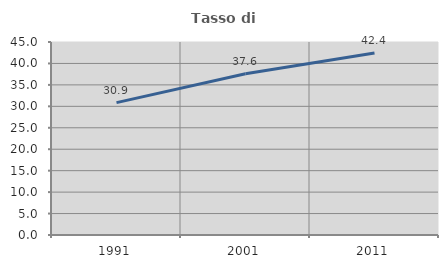
| Category | Tasso di occupazione   |
|---|---|
| 1991.0 | 30.862 |
| 2001.0 | 37.577 |
| 2011.0 | 42.446 |